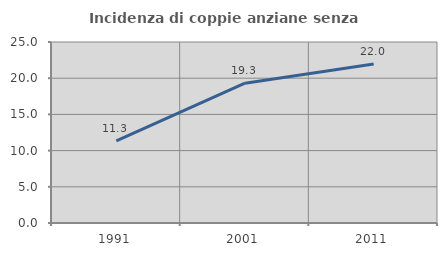
| Category | Incidenza di coppie anziane senza figli  |
|---|---|
| 1991.0 | 11.33 |
| 2001.0 | 19.315 |
| 2011.0 | 21.964 |